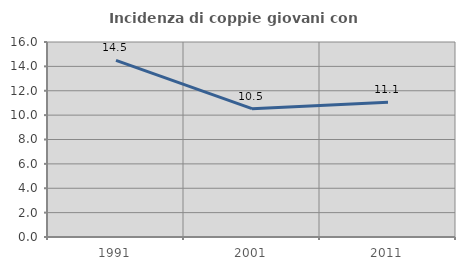
| Category | Incidenza di coppie giovani con figli |
|---|---|
| 1991.0 | 14.495 |
| 2001.0 | 10.526 |
| 2011.0 | 11.054 |